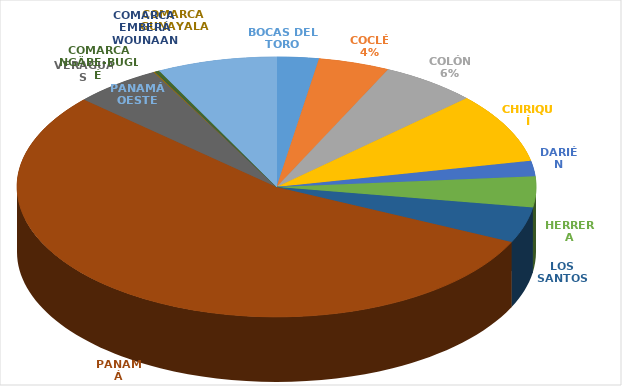
| Category | Cantidad  |
|---|---|
| BOCAS DEL TORO | 154 |
| COCLÉ | 262 |
| COLÓN | 353 |
| CHIRIQUÍ | 513 |
| DARIÉN | 113 |
| HERRERA | 226 |
| LOS SANTOS | 262 |
| PANAMÁ | 3222 |
| VERAGUAS | 321 |
| COMARCA GUNAYALA | 6 |
| COMARCA EMBERÁ WOUNAAN | 1 |
| COMARCA NGÄBE-BUGLÉ | 15 |
| PANAMÁ OESTE | 439 |